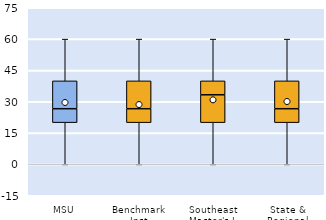
| Category | 25th | 50th | 75th |
|---|---|---|---|
| MSU | 20 | 6.667 | 13.333 |
| Benchmark Inst | 20 | 6.667 | 13.333 |
| Southeast Master's-L | 20 | 13.333 | 6.667 |
| State & Regional | 20 | 6.667 | 13.333 |